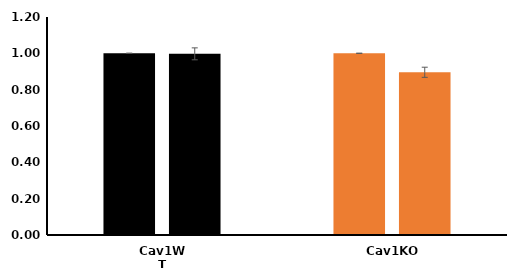
| Category | Control | Rab4 S22N |
|---|---|---|
| Cav1WT | 1 | 0.997 |
| Cav1KO | 1 | 0.896 |